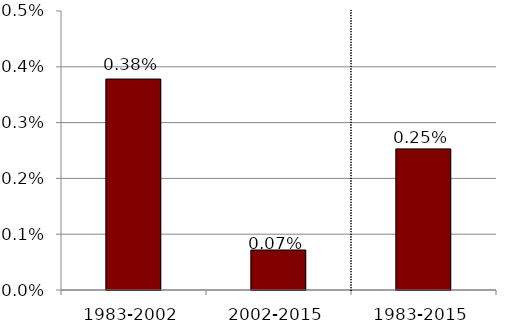
| Category | Series 0 |
|---|---|
| 1983-2002 | 0.004 |
| 2002-2015 | 0.001 |
| 1983-2015 | 0.003 |